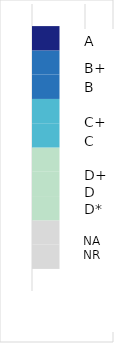
| Category | NU | NA | D* | D | D+ | C | C+ | B | B+ | A |
|---|---|---|---|---|---|---|---|---|---|---|
| NB | 1 | 1 | 1 | 1 | 1 | 1 | 1 | 1 | 1 | 1 |